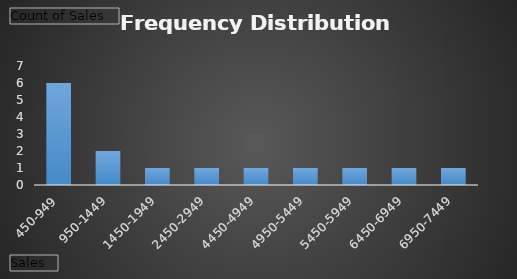
| Category | Total |
|---|---|
| 450-949 | 6 |
| 950-1449 | 2 |
| 1450-1949 | 1 |
| 2450-2949 | 1 |
| 4450-4949 | 1 |
| 4950-5449 | 1 |
| 5450-5949 | 1 |
| 6450-6949 | 1 |
| 6950-7449 | 1 |